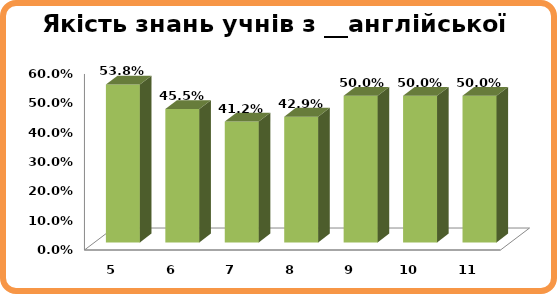
| Category | Series 0 |
|---|---|
| 5.0 | 0.538 |
| 6.0 | 0.455 |
| 7.0 | 0.412 |
| 8.0 | 0.429 |
| 9.0 | 0.5 |
| 10.0 | 0.5 |
| 11.0 | 0.5 |